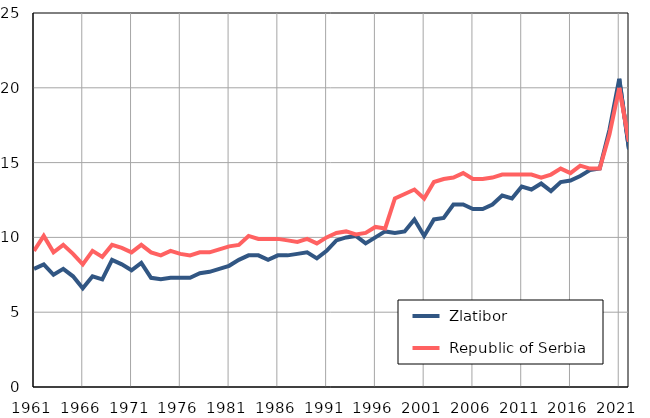
| Category |  Zlatibor |  Republic of Serbia |
|---|---|---|
| 1961.0 | 7.9 | 9.1 |
| 1962.0 | 8.2 | 10.1 |
| 1963.0 | 7.5 | 9 |
| 1964.0 | 7.9 | 9.5 |
| 1965.0 | 7.4 | 8.9 |
| 1966.0 | 6.6 | 8.2 |
| 1967.0 | 7.4 | 9.1 |
| 1968.0 | 7.2 | 8.7 |
| 1969.0 | 8.5 | 9.5 |
| 1970.0 | 8.2 | 9.3 |
| 1971.0 | 7.8 | 9 |
| 1972.0 | 8.3 | 9.5 |
| 1973.0 | 7.3 | 9 |
| 1974.0 | 7.2 | 8.8 |
| 1975.0 | 7.3 | 9.1 |
| 1976.0 | 7.3 | 8.9 |
| 1977.0 | 7.3 | 8.8 |
| 1978.0 | 7.6 | 9 |
| 1979.0 | 7.7 | 9 |
| 1980.0 | 7.9 | 9.2 |
| 1981.0 | 8.1 | 9.4 |
| 1982.0 | 8.5 | 9.5 |
| 1983.0 | 8.8 | 10.1 |
| 1984.0 | 8.8 | 9.9 |
| 1985.0 | 8.5 | 9.9 |
| 1986.0 | 8.8 | 9.9 |
| 1987.0 | 8.8 | 9.8 |
| 1988.0 | 8.9 | 9.7 |
| 1989.0 | 9 | 9.9 |
| 1990.0 | 8.6 | 9.6 |
| 1991.0 | 9.1 | 10 |
| 1992.0 | 9.8 | 10.3 |
| 1993.0 | 10 | 10.4 |
| 1994.0 | 10.1 | 10.2 |
| 1995.0 | 9.6 | 10.3 |
| 1996.0 | 10 | 10.7 |
| 1997.0 | 10.4 | 10.6 |
| 1998.0 | 10.3 | 12.6 |
| 1999.0 | 10.4 | 12.9 |
| 2000.0 | 11.2 | 13.2 |
| 2001.0 | 10.1 | 12.6 |
| 2002.0 | 11.2 | 13.7 |
| 2003.0 | 11.3 | 13.9 |
| 2004.0 | 12.2 | 14 |
| 2005.0 | 12.2 | 14.3 |
| 2006.0 | 11.9 | 13.9 |
| 2007.0 | 11.9 | 13.9 |
| 2008.0 | 12.2 | 14 |
| 2009.0 | 12.8 | 14.2 |
| 2010.0 | 12.6 | 14.2 |
| 2011.0 | 13.4 | 14.2 |
| 2012.0 | 13.2 | 14.2 |
| 2013.0 | 13.6 | 14 |
| 2014.0 | 13.1 | 14.2 |
| 2015.0 | 13.7 | 14.6 |
| 2016.0 | 13.8 | 14.3 |
| 2017.0 | 14.1 | 14.8 |
| 2018.0 | 14.5 | 14.6 |
| 2019.0 | 14.6 | 14.6 |
| 2020.0 | 17.2 | 16.9 |
| 2021.0 | 20.6 | 20 |
| 2022.0 | 15.9 | 16.4 |